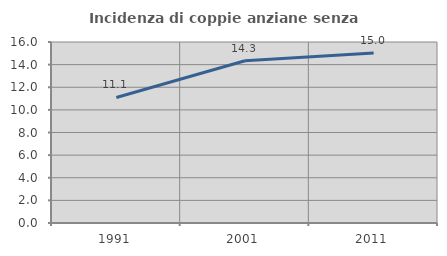
| Category | Incidenza di coppie anziane senza figli  |
|---|---|
| 1991.0 | 11.098 |
| 2001.0 | 14.343 |
| 2011.0 | 15.023 |